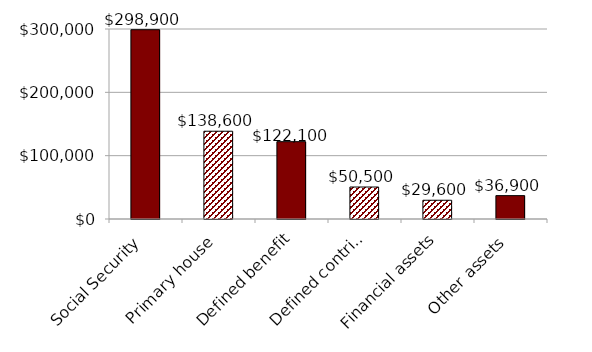
| Category | Series 0 |
|---|---|
| Social Security | 298900 |
| Primary house | 138600 |
| Defined benefit | 122100 |
| Defined contribution | 50500 |
| Financial assets | 29600 |
| Other assets | 36900 |